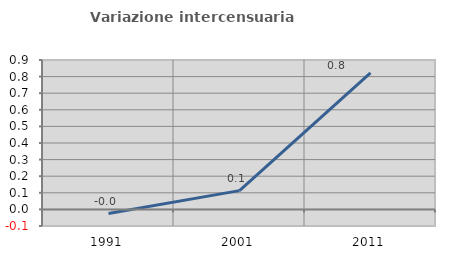
| Category | Variazione intercensuaria annua |
|---|---|
| 1991.0 | -0.025 |
| 2001.0 | 0.113 |
| 2011.0 | 0.822 |